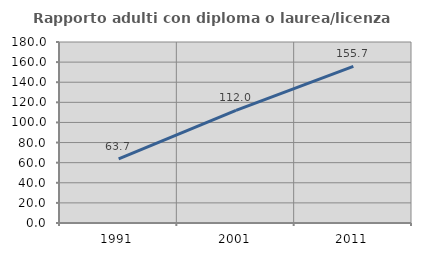
| Category | Rapporto adulti con diploma o laurea/licenza media  |
|---|---|
| 1991.0 | 63.733 |
| 2001.0 | 111.989 |
| 2011.0 | 155.733 |